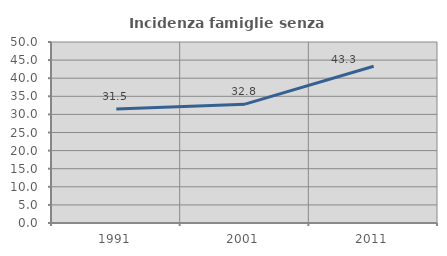
| Category | Incidenza famiglie senza nuclei |
|---|---|
| 1991.0 | 31.507 |
| 2001.0 | 32.836 |
| 2011.0 | 43.284 |